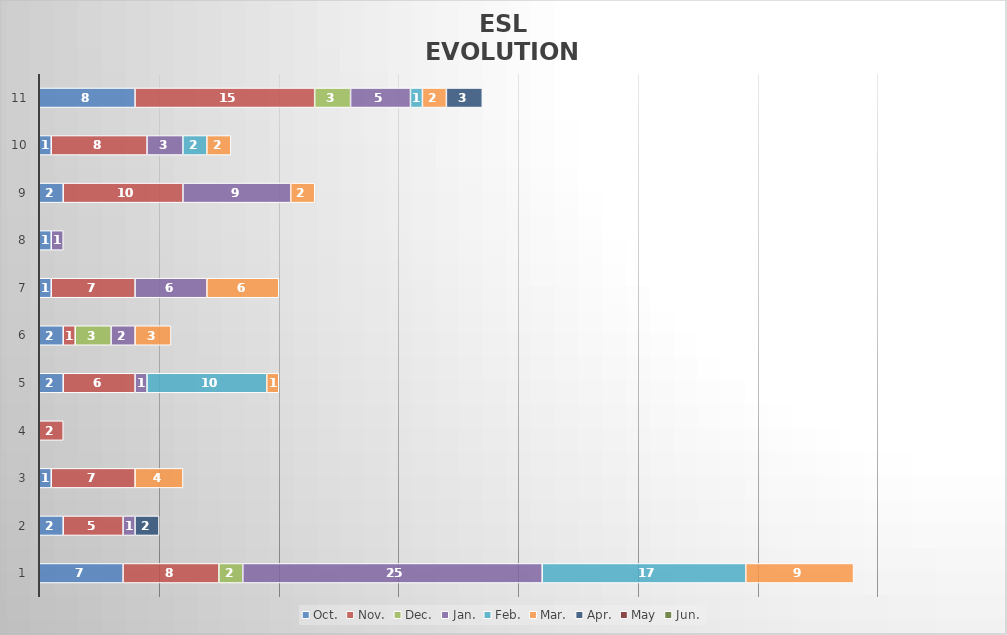
| Category | Oct. | Nov. | Dec. | Jan. | Feb. | Mar. | Apr. | May | Jun. |
|---|---|---|---|---|---|---|---|---|---|
| 1.0 | 7 | 8 | 2 | 25 | 17 | 9 | 0 | 0 | 0 |
| 2.0 | 2 | 5 | 0 | 1 | 0 | 0 | 2 | 0 | 0 |
| 3.0 | 1 | 7 | 0 | 0 | 0 | 4 | 0 | 0 | 0 |
| 4.0 | 0 | 2 | 0 | 0 | 0 | 0 | 0 | 0 | 0 |
| 5.0 | 2 | 6 | 0 | 1 | 10 | 1 | 0 | 0 | 0 |
| 6.0 | 2 | 1 | 3 | 2 | 0 | 3 | 0 | 0 | 0 |
| 7.0 | 1 | 7 | 0 | 6 | 0 | 6 | 0 | 0 | 0 |
| 8.0 | 1 | 0 | 0 | 1 | 0 | 0 | 0 | 0 | 0 |
| 9.0 | 2 | 10 | 0 | 9 | 0 | 2 | 0 | 0 | 0 |
| 10.0 | 1 | 8 | 0 | 3 | 2 | 2 | 0 | 0 | 0 |
| 11.0 | 8 | 15 | 3 | 5 | 1 | 2 | 3 | 0 | 0 |